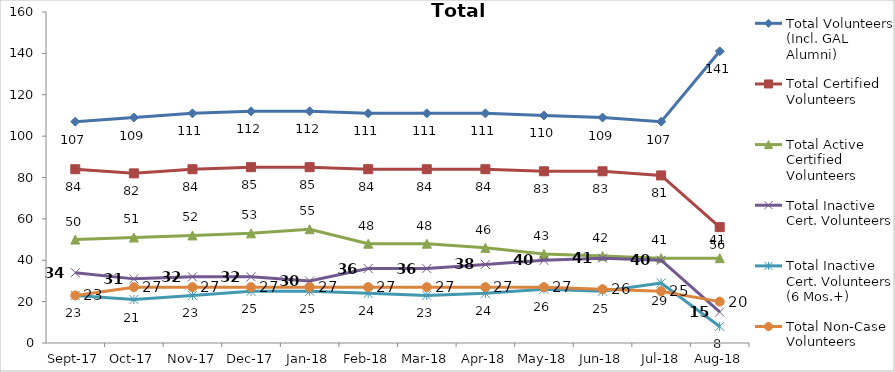
| Category | Total Volunteers (Incl. GAL Alumni) | Total Certified Volunteers | Total Active Certified Volunteers | Total Inactive Cert. Volunteers | Total Inactive Cert. Volunteers (6 Mos.+) | Total Non-Case Volunteers |
|---|---|---|---|---|---|---|
| 2017-09-01 | 107 | 84 | 50 | 34 | 23 | 23 |
| 2017-10-01 | 109 | 82 | 51 | 31 | 21 | 27 |
| 2017-11-01 | 111 | 84 | 52 | 32 | 23 | 27 |
| 2017-12-01 | 112 | 85 | 53 | 32 | 25 | 27 |
| 2018-01-01 | 112 | 85 | 55 | 30 | 25 | 27 |
| 2018-02-01 | 111 | 84 | 48 | 36 | 24 | 27 |
| 2018-03-01 | 111 | 84 | 48 | 36 | 23 | 27 |
| 2018-04-01 | 111 | 84 | 46 | 38 | 24 | 27 |
| 2018-05-01 | 110 | 83 | 43 | 40 | 26 | 27 |
| 2018-06-01 | 109 | 83 | 42 | 41 | 25 | 26 |
| 2018-07-01 | 107 | 81 | 41 | 40 | 29 | 25 |
| 2018-08-01 | 141 | 56 | 41 | 15 | 8 | 20 |